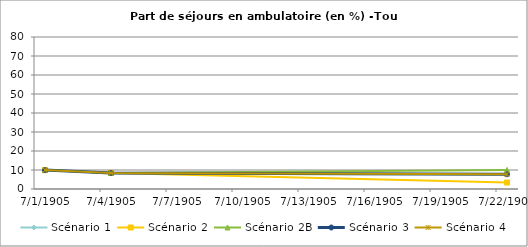
| Category | Scénario 1 | Scénario 2 | Scénario 2B | Scénario 3 | Scénario 4 |
|---|---|---|---|---|---|
| 2009.0 | 9.958 | 9.958 | 9.958 | 9.958 | 9.958 |
| 2012.0 | 8.46 | 8.46 | 8.46 | 8.46 | 8.46 |
| 2030.0 | 7.748 | 3.404 | 10.041 | 7.748 | 7.748 |